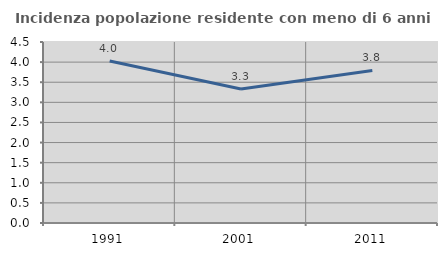
| Category | Incidenza popolazione residente con meno di 6 anni |
|---|---|
| 1991.0 | 4.027 |
| 2001.0 | 3.333 |
| 2011.0 | 3.791 |